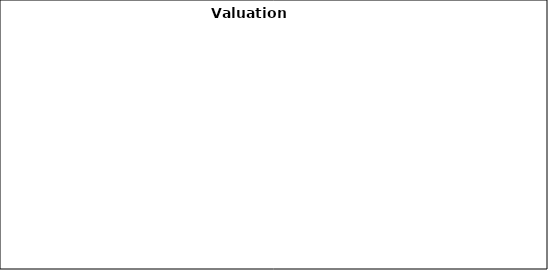
| Category | Series 0 |
|---|---|
| Current Market Price | 77.93 |
| Intrinsic Value Price | 83.104 |
| Dividend Discount Model | 68.99 |
| Comparable Trading Multiples | 82.884 |
| Comparable Acquisition Multiples | 68.995 |
| DCF Analysis | 85.507 |